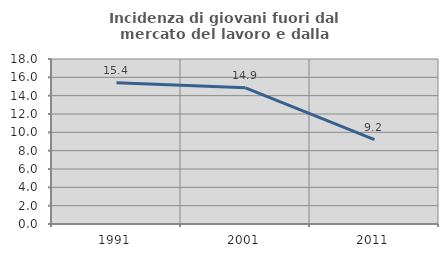
| Category | Incidenza di giovani fuori dal mercato del lavoro e dalla formazione  |
|---|---|
| 1991.0 | 15.411 |
| 2001.0 | 14.86 |
| 2011.0 | 9.202 |